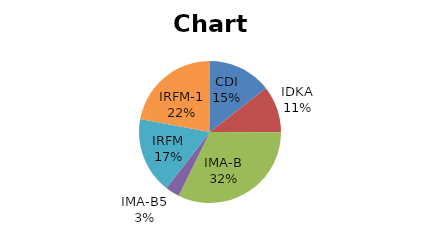
| Category | Series 0 |
|---|---|
| CDI | 14.412 |
| IDKA | 10.623 |
| IMA-B | 32.237 |
| IMA-B5 | 3.248 |
| IRFM | 17.405 |
| IRFM-1 | 22.075 |